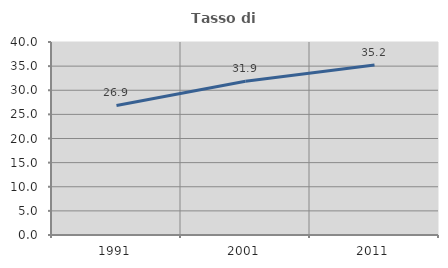
| Category | Tasso di occupazione   |
|---|---|
| 1991.0 | 26.86 |
| 2001.0 | 31.86 |
| 2011.0 | 35.234 |